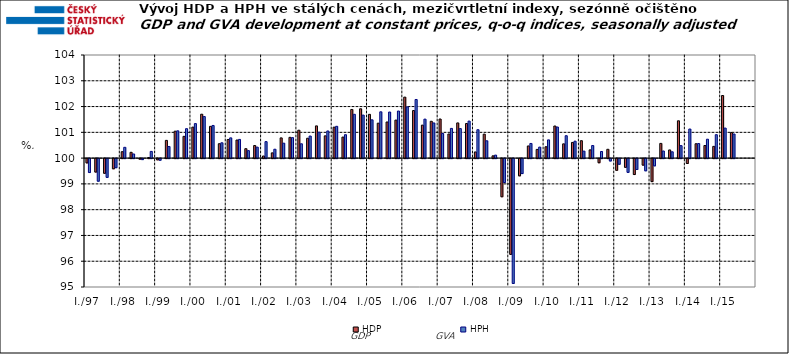
| Category | HDP

 | HPH

 |
|---|---|---|
| I./97 | 99.833 | 99.46 |
|  | 99.478 | 99.123 |
|  | 99.43 | 99.272 |
|  | 99.605 | 99.647 |
| I./98 | 100.249 | 100.419 |
|  | 100.226 | 100.161 |
|  | 99.979 | 99.962 |
|  | 100.024 | 100.26 |
| I./99 | 99.951 | 99.938 |
|  | 100.688 | 100.451 |
|  | 101.045 | 101.059 |
|  | 100.845 | 101.141 |
| I./00 | 101.203 | 101.339 |
|  | 101.703 | 101.612 |
|  | 101.232 | 101.266 |
|  | 100.559 | 100.594 |
| I./01 | 100.723 | 100.785 |
|  | 100.702 | 100.725 |
|  | 100.366 | 100.29 |
|  | 100.488 | 100.426 |
| I./02 | 100.081 | 100.639 |
|  | 100.203 | 100.345 |
|  | 100.784 | 100.58 |
|  | 100.806 | 100.795 |
| I./03 | 101.083 | 100.556 |
|  | 100.771 | 100.857 |
|  | 101.249 | 101.007 |
|  | 100.864 | 101.052 |
| I./04 | 101.201 | 101.233 |
|  | 100.816 | 100.907 |
|  | 101.887 | 101.699 |
|  | 101.914 | 101.668 |
| I./05 | 101.698 | 101.485 |
|  | 101.355 | 101.796 |
|  | 101.401 | 101.787 |
|  | 101.474 | 101.826 |
| I./06 | 102.366 | 101.987 |
|  | 101.845 | 102.274 |
|  | 101.279 | 101.512 |
|  | 101.429 | 101.364 |
| I./07 | 101.517 | 100.957 |
|  | 100.936 | 101.152 |
|  | 101.366 | 101.145 |
|  | 101.342 | 101.435 |
| I./08 | 100.239 | 101.102 |
|  | 100.93 | 100.672 |
|  | 100.087 | 100.116 |
|  | 98.52 | 99.072 |
| I./09 | 96.285 | 95.157 |
|  | 99.331 | 99.42 |
|  | 100.471 | 100.568 |
|  | 100.338 | 100.427 |
| I./10 | 100.44 | 100.707 |
|  | 101.245 | 101.206 |
|  | 100.553 | 100.869 |
|  | 100.608 | 100.657 |
| I./11 | 100.676 | 100.272 |
|  | 100.32 | 100.488 |
|  | 99.839 | 100.256 |
|  | 100.342 | 99.908 |
| I./12 | 99.546 | 99.781 |
|  | 99.661 | 99.466 |
|  | 99.382 | 99.578 |
|  | 99.747 | 99.527 |
| I./13 | 99.108 | 99.719 |
|  | 100.571 | 100.276 |
|  | 100.317 | 100.245 |
|  | 101.447 | 100.485 |
| I./14 | 99.81 | 101.129 |
|  | 100.557 | 100.565 |
|  | 100.489 | 100.733 |
|  | 100.455 | 100.909 |
| I./15 | 102.429 | 101.165 |